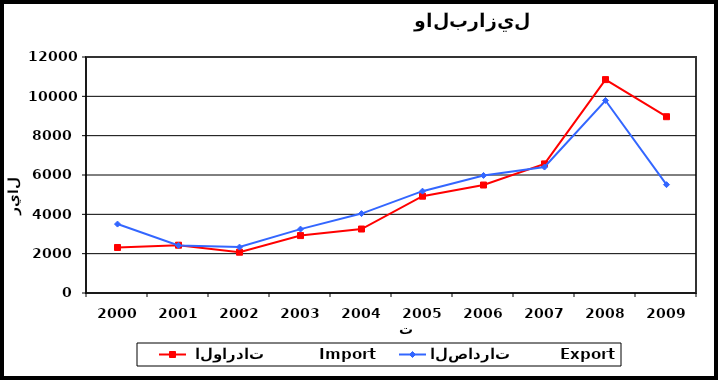
| Category |  الواردات           Import | الصادرات          Export |
|---|---|---|
| 2000.0 | 2314 | 3505 |
| 2001.0 | 2431 | 2417 |
| 2002.0 | 2074 | 2335 |
| 2003.0 | 2919 | 3249 |
| 2004.0 | 3253 | 4038 |
| 2005.0 | 4922 | 5178 |
| 2006.0 | 5490 | 5977 |
| 2007.0 | 6564 | 6405 |
| 2008.0 | 10851 | 9790 |
| 2009.0 | 8964 | 5509 |